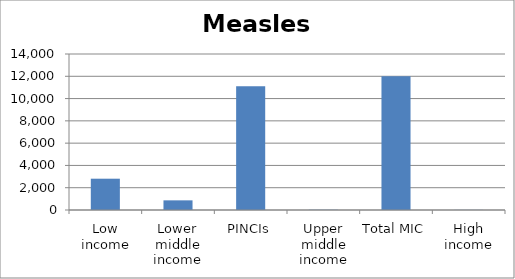
| Category | Series 0 |
|---|---|
| Low income | 2808.889 |
| Lower middle income | 866.032 |
| PINCIs | 11112.151 |
| Upper middle income | 22.343 |
| Total MIC | 12000.526 |
| High income | 10.827 |